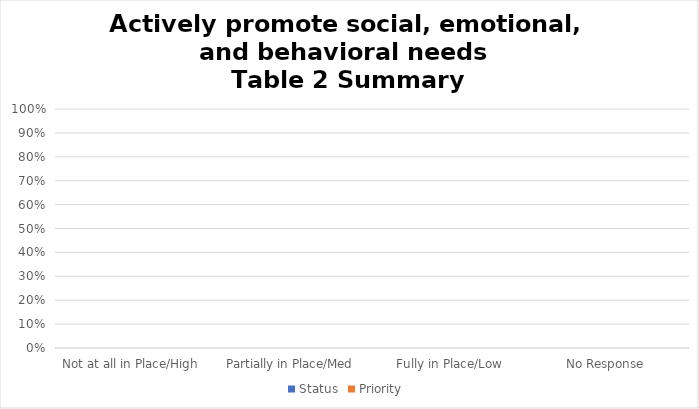
| Category | Status | Priority  |
|---|---|---|
| Not at all in Place/High  | 0 | 0 |
| Partially in Place/Med | 0 | 0 |
| Fully in Place/Low | 0 | 0 |
| No Response  | 0 | 0 |